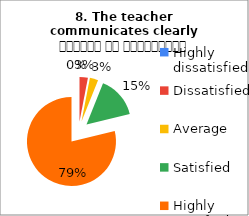
| Category | 8. The teacher communicates clearly शिक्षक का सम्प्रेषण सुस्पष्ट है |
|---|---|
| Highly dissatisfied | 0 |
| Dissatisfied | 1 |
| Average | 1 |
| Satisfied | 5 |
| Highly satisfied | 26 |